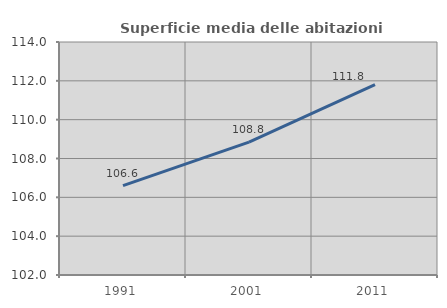
| Category | Superficie media delle abitazioni occupate |
|---|---|
| 1991.0 | 106.599 |
| 2001.0 | 108.844 |
| 2011.0 | 111.802 |